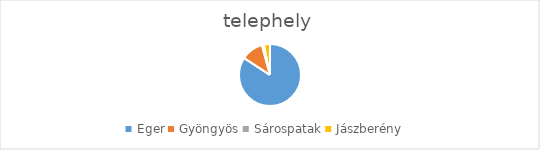
| Category | Series 0 |
|---|---|
| Eger | 522 |
| Gyöngyös | 72 |
| Sárospatak | 6 |
| Jászberény | 20 |